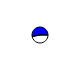
| Category | Series 0 |
|---|---|
| 0 | 10721 |
| 1 | 12094 |